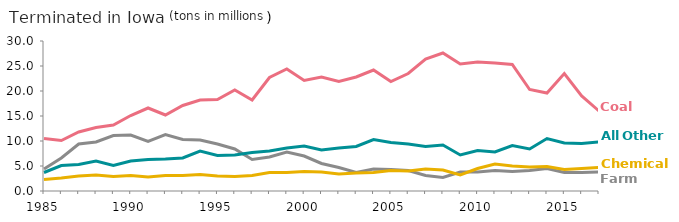
| Category | TerminatedFarm | TerminatedCoal | TerminatedChemical | TerminatedAl Other |
|---|---|---|---|---|
| 1985.0 | 4.4 | 10.5 | 2.3 | 3.7 |
| 1986.0 | 6.6 | 10.1 | 2.6 | 5.1 |
| 1987.0 | 9.4 | 11.8 | 3 | 5.3 |
| 1988.0 | 9.8 | 12.7 | 3.2 | 6 |
| 1989.0 | 11.1 | 13.2 | 2.9 | 5.1 |
| 1990.0 | 11.2 | 15.1 | 3.1 | 6 |
| 1991.0 | 9.9 | 16.6 | 2.8 | 6.3 |
| 1992.0 | 11.3 | 15.2 | 3.1 | 6.4 |
| 1993.0 | 10.3 | 17.1 | 3.1 | 6.6 |
| 1994.0 | 10.2 | 18.2 | 3.3 | 8 |
| 1995.0 | 9.4 | 18.3 | 3 | 7.1 |
| 1996.0 | 8.4 | 20.2 | 2.9 | 7.2 |
| 1997.0 | 6.3 | 18.2 | 3.1 | 7.7 |
| 1998.0 | 6.8 | 22.7 | 3.7 | 8 |
| 1999.0 | 7.8 | 24.4 | 3.7 | 8.6 |
| 2000.0 | 7 | 22.1 | 3.9 | 9 |
| 2001.0 | 5.5 | 22.8 | 3.8 | 8.2 |
| 2002.0 | 4.7 | 21.9 | 3.4 | 8.6 |
| 2003.0 | 3.7 | 22.8 | 3.6 | 8.9 |
| 2004.0 | 4.4 | 24.2 | 3.7 | 10.3 |
| 2005.0 | 4.3 | 21.9 | 4.1 | 9.7 |
| 2006.0 | 4.1 | 23.5 | 4 | 9.4 |
| 2007.0 | 3.1 | 26.4 | 4.4 | 8.9 |
| 2008.0 | 2.7 | 27.6 | 4.2 | 9.2 |
| 2009.0 | 3.8 | 25.4 | 3.2 | 7.2 |
| 2010.0 | 3.8 | 25.8 | 4.5 | 8.1 |
| 2011.0 | 4.1 | 25.6 | 5.4 | 7.8 |
| 2012.0 | 3.9 | 25.3 | 5 | 9.1 |
| 2013.0 | 4.1 | 20.3 | 4.8 | 8.4 |
| 2014.0 | 4.5 | 19.6 | 4.9 | 10.5 |
| 2015.0 | 3.7 | 23.5 | 4.3 | 9.6 |
| 2016.0 | 3.7 | 19 | 4.5 | 9.5 |
| 2017.0 | 3.8 | 16 | 4.7 | 9.8 |